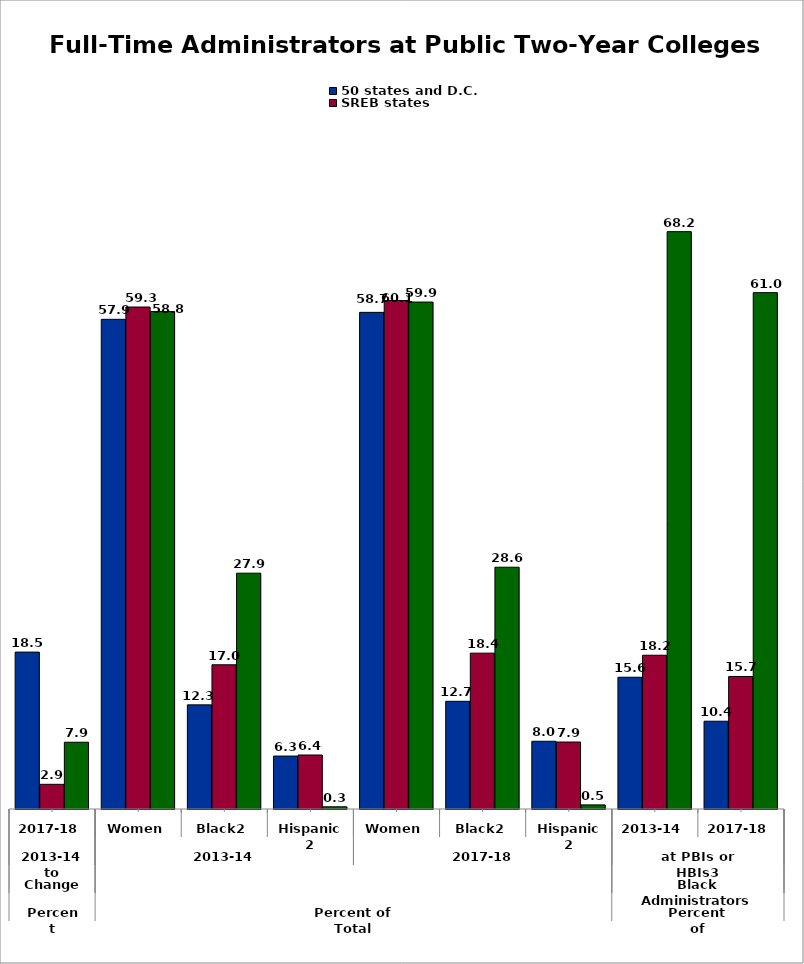
| Category | 50 states and D.C. | SREB states | State |
|---|---|---|---|
| 0 | 18.541 | 2.916 | 7.888 |
| 1 | 57.865 | 59.318 | 58.779 |
| 2 | 12.305 | 17.042 | 27.865 |
| 3 | 6.254 | 6.38 | 0.26 |
| 4 | 58.688 | 60.087 | 59.906 |
| 5 | 12.727 | 18.417 | 28.571 |
| 6 | 8.005 | 7.915 | 0.484 |
| 7 | 15.57 | 18.169 | 68.224 |
| 8 | 10.373 | 15.661 | 61.017 |